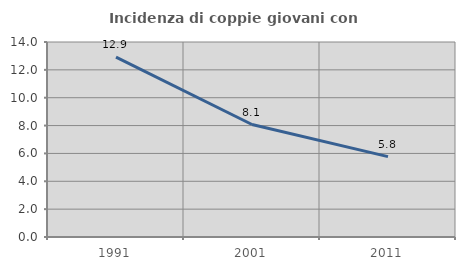
| Category | Incidenza di coppie giovani con figli |
|---|---|
| 1991.0 | 12.908 |
| 2001.0 | 8.076 |
| 2011.0 | 5.769 |